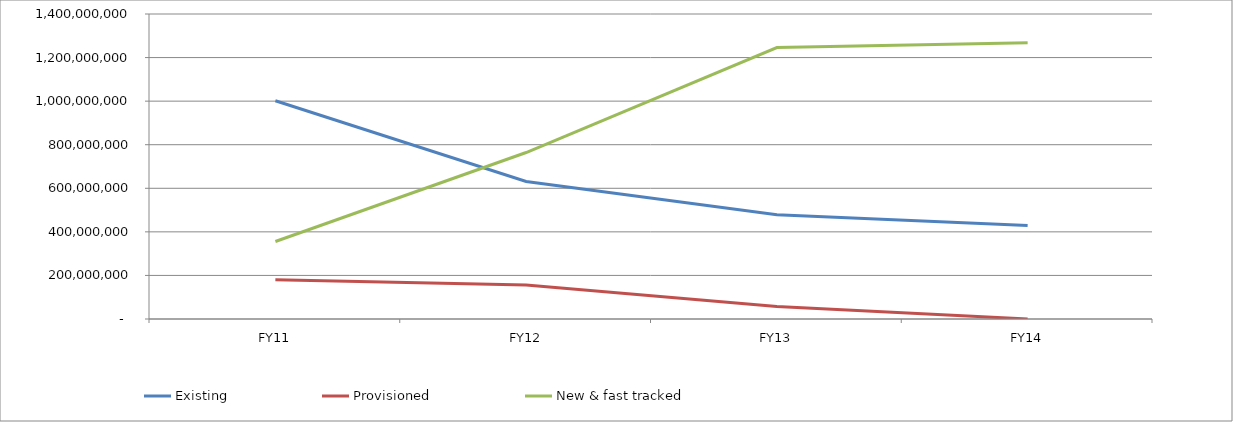
| Category | Existing | Provisioned | New & fast tracked |
|---|---|---|---|
| FY11_x000d_ | 1001976309.331 | 180442874.822 | 355667815.847 |
| FY12_x000d_ | 631572172.3 | 156549520.2 | 764127154.7 |
| FY13_x000d_ | 478188841.2 | 57920881.7 | 1245932510.7 |
| FY14_x000d_ | 429704422.2 | 0 | 1268463689 |